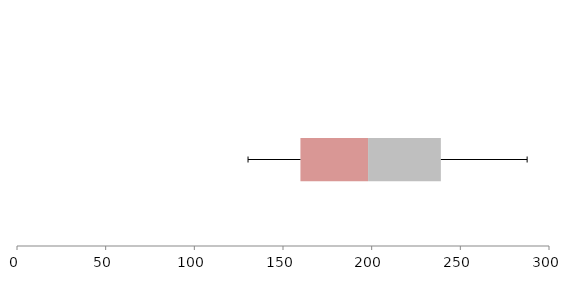
| Category | Series 1 | Series 2 | Series 3 |
|---|---|---|---|
| 0 | 159.831 | 38.139 | 41.049 |